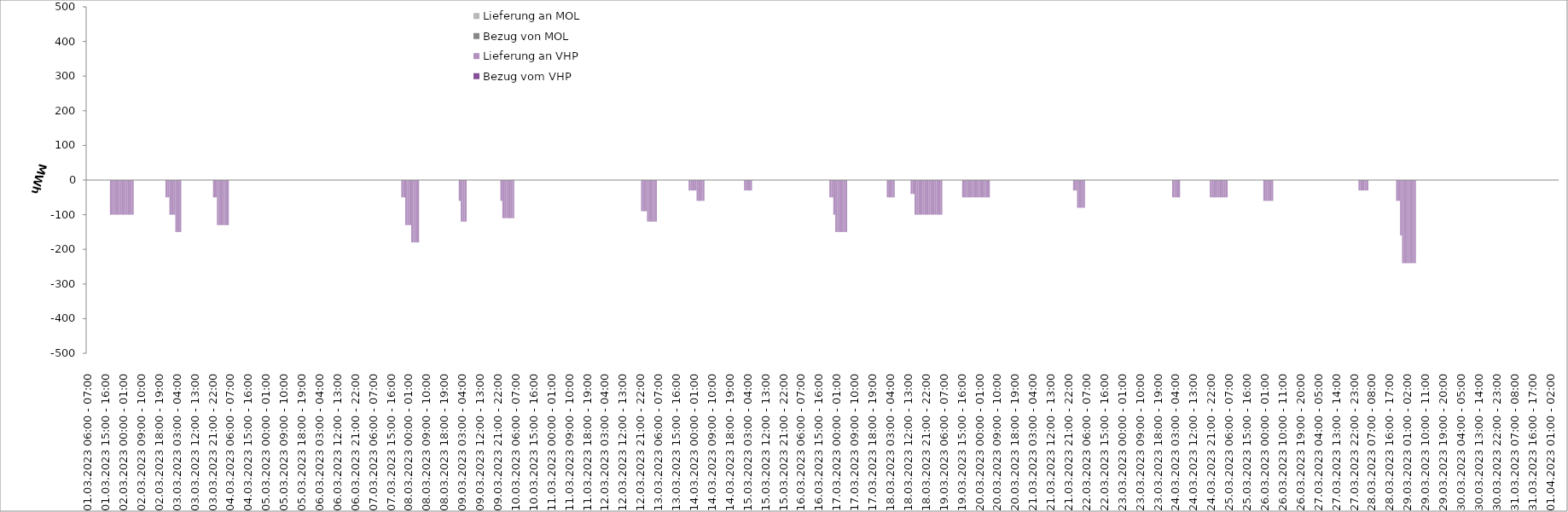
| Category | Bezug vom VHP | Lieferung an VHP | Bezug von MOL | Lieferung an MOL |
|---|---|---|---|---|
| 01.03.2023 06:00 - 07:00 | 0 | 0 | 0 | 0 |
| 01.03.2023 07:00 - 08:00 | 0 | 0 | 0 | 0 |
| 01.03.2023 08:00 - 09:00 | 0 | 0 | 0 | 0 |
| 01.03.2023 09:00 - 10:00 | 0 | 0 | 0 | 0 |
| 01.03.2023 10:00 - 11:00 | 0 | 0 | 0 | 0 |
| 01.03.2023 11:00 - 12:00 | 0 | 0 | 0 | 0 |
| 01.03.2023 12:00 - 13:00 | 0 | 0 | 0 | 0 |
| 01.03.2023 13:00 - 14:00 | 0 | 0 | 0 | 0 |
| 01.03.2023 14:00 - 15:00 | 0 | 0 | 0 | 0 |
| 01.03.2023 15:00 - 16:00 | 0 | 0 | 0 | 0 |
| 01.03.2023 16:00 - 17:00 | 0 | 0 | 0 | 0 |
| 01.03.2023 17:00 - 18:00 | 0 | 0 | 0 | 0 |
| 01.03.2023 18:00 - 19:00 | 0 | -100 | 0 | 0 |
| 01.03.2023 19:00 - 20:00 | 0 | -100 | 0 | 0 |
| 01.03.2023 20:00 - 21:00 | 0 | -100 | 0 | 0 |
| 01.03.2023 21:00 - 22:00 | 0 | -100 | 0 | 0 |
| 01.03.2023 22:00 - 23:00 | 0 | -100 | 0 | 0 |
| 01.03.2023 23:00 - 24:00 | 0 | -100 | 0 | 0 |
| 02.03.2023 00:00 - 01:00 | 0 | -100 | 0 | 0 |
| 02.03.2023 01:00 - 02:00 | 0 | -100 | 0 | 0 |
| 02.03.2023 02:00 - 03:00 | 0 | -100 | 0 | 0 |
| 02.03.2023 03:00 - 04:00 | 0 | -100 | 0 | 0 |
| 02.03.2023 04:00 - 05:00 | 0 | -100 | 0 | 0 |
| 02.03.2023 05:00 - 06:00 | 0 | -100 | 0 | 0 |
| 02.03.2023 06:00 - 07:00 | 0 | 0 | 0 | 0 |
| 02.03.2023 07:00 - 08:00 | 0 | 0 | 0 | 0 |
| 02.03.2023 08:00 - 09:00 | 0 | 0 | 0 | 0 |
| 02.03.2023 09:00 - 10:00 | 0 | 0 | 0 | 0 |
| 02.03.2023 10:00 - 11:00 | 0 | 0 | 0 | 0 |
| 02.03.2023 11:00 - 12:00 | 0 | 0 | 0 | 0 |
| 02.03.2023 12:00 - 13:00 | 0 | 0 | 0 | 0 |
| 02.03.2023 13:00 - 14:00 | 0 | 0 | 0 | 0 |
| 02.03.2023 14:00 - 15:00 | 0 | 0 | 0 | 0 |
| 02.03.2023 15:00 - 16:00 | 0 | 0 | 0 | 0 |
| 02.03.2023 16:00 - 17:00 | 0 | 0 | 0 | 0 |
| 02.03.2023 17:00 - 18:00 | 0 | 0 | 0 | 0 |
| 02.03.2023 18:00 - 19:00 | 0 | 0 | 0 | 0 |
| 02.03.2023 19:00 - 20:00 | 0 | 0 | 0 | 0 |
| 02.03.2023 20:00 - 21:00 | 0 | 0 | 0 | 0 |
| 02.03.2023 21:00 - 22:00 | 0 | 0 | 0 | 0 |
| 02.03.2023 22:00 - 23:00 | 0 | -50 | 0 | 0 |
| 02.03.2023 23:00 - 24:00 | 0 | -50 | 0 | 0 |
| 03.03.2023 00:00 - 01:00 | 0 | -100 | 0 | 0 |
| 03.03.2023 01:00 - 02:00 | 0 | -100 | 0 | 0 |
| 03.03.2023 02:00 - 03:00 | 0 | -100 | 0 | 0 |
| 03.03.2023 03:00 - 04:00 | 0 | -150 | 0 | 0 |
| 03.03.2023 04:00 - 05:00 | 0 | -150 | 0 | 0 |
| 03.03.2023 05:00 - 06:00 | 0 | -150 | 0 | 0 |
| 03.03.2023 06:00 - 07:00 | 0 | 0 | 0 | 0 |
| 03.03.2023 07:00 - 08:00 | 0 | 0 | 0 | 0 |
| 03.03.2023 08:00 - 09:00 | 0 | 0 | 0 | 0 |
| 03.03.2023 09:00 - 10:00 | 0 | 0 | 0 | 0 |
| 03.03.2023 10:00 - 11:00 | 0 | 0 | 0 | 0 |
| 03.03.2023 11:00 - 12:00 | 0 | 0 | 0 | 0 |
| 03.03.2023 12:00 - 13:00 | 0 | 0 | 0 | 0 |
| 03.03.2023 13:00 - 14:00 | 0 | 0 | 0 | 0 |
| 03.03.2023 14:00 - 15:00 | 0 | 0 | 0 | 0 |
| 03.03.2023 15:00 - 16:00 | 0 | 0 | 0 | 0 |
| 03.03.2023 16:00 - 17:00 | 0 | 0 | 0 | 0 |
| 03.03.2023 17:00 - 18:00 | 0 | 0 | 0 | 0 |
| 03.03.2023 18:00 - 19:00 | 0 | 0 | 0 | 0 |
| 03.03.2023 19:00 - 20:00 | 0 | 0 | 0 | 0 |
| 03.03.2023 20:00 - 21:00 | 0 | 0 | 0 | 0 |
| 03.03.2023 21:00 - 22:00 | 0 | 0 | 0 | 0 |
| 03.03.2023 22:00 - 23:00 | 0 | -50 | 0 | 0 |
| 03.03.2023 23:00 - 24:00 | 0 | -50 | 0 | 0 |
| 04.03.2023 00:00 - 01:00 | 0 | -130 | 0 | 0 |
| 04.03.2023 01:00 - 02:00 | 0 | -130 | 0 | 0 |
| 04.03.2023 02:00 - 03:00 | 0 | -130 | 0 | 0 |
| 04.03.2023 03:00 - 04:00 | 0 | -130 | 0 | 0 |
| 04.03.2023 04:00 - 05:00 | 0 | -130 | 0 | 0 |
| 04.03.2023 05:00 - 06:00 | 0 | -130 | 0 | 0 |
| 04.03.2023 06:00 - 07:00 | 0 | 0 | 0 | 0 |
| 04.03.2023 07:00 - 08:00 | 0 | 0 | 0 | 0 |
| 04.03.2023 08:00 - 09:00 | 0 | 0 | 0 | 0 |
| 04.03.2023 09:00 - 10:00 | 0 | 0 | 0 | 0 |
| 04.03.2023 10:00 - 11:00 | 0 | 0 | 0 | 0 |
| 04.03.2023 11:00 - 12:00 | 0 | 0 | 0 | 0 |
| 04.03.2023 12:00 - 13:00 | 0 | 0 | 0 | 0 |
| 04.03.2023 13:00 - 14:00 | 0 | 0 | 0 | 0 |
| 04.03.2023 14:00 - 15:00 | 0 | 0 | 0 | 0 |
| 04.03.2023 15:00 - 16:00 | 0 | 0 | 0 | 0 |
| 04.03.2023 16:00 - 17:00 | 0 | 0 | 0 | 0 |
| 04.03.2023 17:00 - 18:00 | 0 | 0 | 0 | 0 |
| 04.03.2023 18:00 - 19:00 | 0 | 0 | 0 | 0 |
| 04.03.2023 19:00 - 20:00 | 0 | 0 | 0 | 0 |
| 04.03.2023 20:00 - 21:00 | 0 | 0 | 0 | 0 |
| 04.03.2023 21:00 - 22:00 | 0 | 0 | 0 | 0 |
| 04.03.2023 22:00 - 23:00 | 0 | 0 | 0 | 0 |
| 04.03.2023 23:00 - 24:00 | 0 | 0 | 0 | 0 |
| 05.03.2023 00:00 - 01:00 | 0 | 0 | 0 | 0 |
| 05.03.2023 01:00 - 02:00 | 0 | 0 | 0 | 0 |
| 05.03.2023 02:00 - 03:00 | 0 | 0 | 0 | 0 |
| 05.03.2023 03:00 - 04:00 | 0 | 0 | 0 | 0 |
| 05.03.2023 04:00 - 05:00 | 0 | 0 | 0 | 0 |
| 05.03.2023 05:00 - 06:00 | 0 | 0 | 0 | 0 |
| 05.03.2023 06:00 - 07:00 | 0 | 0 | 0 | 0 |
| 05.03.2023 07:00 - 08:00 | 0 | 0 | 0 | 0 |
| 05.03.2023 08:00 - 09:00 | 0 | 0 | 0 | 0 |
| 05.03.2023 09:00 - 10:00 | 0 | 0 | 0 | 0 |
| 05.03.2023 10:00 - 11:00 | 0 | 0 | 0 | 0 |
| 05.03.2023 11:00 - 12:00 | 0 | 0 | 0 | 0 |
| 05.03.2023 12:00 - 13:00 | 0 | 0 | 0 | 0 |
| 05.03.2023 13:00 - 14:00 | 0 | 0 | 0 | 0 |
| 05.03.2023 14:00 - 15:00 | 0 | 0 | 0 | 0 |
| 05.03.2023 15:00 - 16:00 | 0 | 0 | 0 | 0 |
| 05.03.2023 16:00 - 17:00 | 0 | 0 | 0 | 0 |
| 05.03.2023 17:00 - 18:00 | 0 | 0 | 0 | 0 |
| 05.03.2023 18:00 - 19:00 | 0 | 0 | 0 | 0 |
| 05.03.2023 19:00 - 20:00 | 0 | 0 | 0 | 0 |
| 05.03.2023 20:00 - 21:00 | 0 | 0 | 0 | 0 |
| 05.03.2023 21:00 - 22:00 | 0 | 0 | 0 | 0 |
| 05.03.2023 22:00 - 23:00 | 0 | 0 | 0 | 0 |
| 05.03.2023 23:00 - 24:00 | 0 | 0 | 0 | 0 |
| 06.03.2023 00:00 - 01:00 | 0 | 0 | 0 | 0 |
| 06.03.2023 01:00 - 02:00 | 0 | 0 | 0 | 0 |
| 06.03.2023 02:00 - 03:00 | 0 | 0 | 0 | 0 |
| 06.03.2023 03:00 - 04:00 | 0 | 0 | 0 | 0 |
| 06.03.2023 04:00 - 05:00 | 0 | 0 | 0 | 0 |
| 06.03.2023 05:00 - 06:00 | 0 | 0 | 0 | 0 |
| 06.03.2023 06:00 - 07:00 | 0 | 0 | 0 | 0 |
| 06.03.2023 07:00 - 08:00 | 0 | 0 | 0 | 0 |
| 06.03.2023 08:00 - 09:00 | 0 | 0 | 0 | 0 |
| 06.03.2023 09:00 - 10:00 | 0 | 0 | 0 | 0 |
| 06.03.2023 10:00 - 11:00 | 0 | 0 | 0 | 0 |
| 06.03.2023 11:00 - 12:00 | 0 | 0 | 0 | 0 |
| 06.03.2023 12:00 - 13:00 | 0 | 0 | 0 | 0 |
| 06.03.2023 13:00 - 14:00 | 0 | 0 | 0 | 0 |
| 06.03.2023 14:00 - 15:00 | 0 | 0 | 0 | 0 |
| 06.03.2023 15:00 - 16:00 | 0 | 0 | 0 | 0 |
| 06.03.2023 16:00 - 17:00 | 0 | 0 | 0 | 0 |
| 06.03.2023 17:00 - 18:00 | 0 | 0 | 0 | 0 |
| 06.03.2023 18:00 - 19:00 | 0 | 0 | 0 | 0 |
| 06.03.2023 19:00 - 20:00 | 0 | 0 | 0 | 0 |
| 06.03.2023 20:00 - 21:00 | 0 | 0 | 0 | 0 |
| 06.03.2023 21:00 - 22:00 | 0 | 0 | 0 | 0 |
| 06.03.2023 22:00 - 23:00 | 0 | 0 | 0 | 0 |
| 06.03.2023 23:00 - 24:00 | 0 | 0 | 0 | 0 |
| 07.03.2023 00:00 - 01:00 | 0 | 0 | 0 | 0 |
| 07.03.2023 01:00 - 02:00 | 0 | 0 | 0 | 0 |
| 07.03.2023 02:00 - 03:00 | 0 | 0 | 0 | 0 |
| 07.03.2023 03:00 - 04:00 | 0 | 0 | 0 | 0 |
| 07.03.2023 04:00 - 05:00 | 0 | 0 | 0 | 0 |
| 07.03.2023 05:00 - 06:00 | 0 | 0 | 0 | 0 |
| 07.03.2023 06:00 - 07:00 | 0 | 0 | 0 | 0 |
| 07.03.2023 07:00 - 08:00 | 0 | 0 | 0 | 0 |
| 07.03.2023 08:00 - 09:00 | 0 | 0 | 0 | 0 |
| 07.03.2023 09:00 - 10:00 | 0 | 0 | 0 | 0 |
| 07.03.2023 10:00 - 11:00 | 0 | 0 | 0 | 0 |
| 07.03.2023 11:00 - 12:00 | 0 | 0 | 0 | 0 |
| 07.03.2023 12:00 - 13:00 | 0 | 0 | 0 | 0 |
| 07.03.2023 13:00 - 14:00 | 0 | 0 | 0 | 0 |
| 07.03.2023 14:00 - 15:00 | 0 | 0 | 0 | 0 |
| 07.03.2023 15:00 - 16:00 | 0 | 0 | 0 | 0 |
| 07.03.2023 16:00 - 17:00 | 0 | 0 | 0 | 0 |
| 07.03.2023 17:00 - 18:00 | 0 | 0 | 0 | 0 |
| 07.03.2023 18:00 - 19:00 | 0 | 0 | 0 | 0 |
| 07.03.2023 19:00 - 20:00 | 0 | 0 | 0 | 0 |
| 07.03.2023 20:00 - 21:00 | 0 | 0 | 0 | 0 |
| 07.03.2023 21:00 - 22:00 | 0 | -50 | 0 | 0 |
| 07.03.2023 22:00 - 23:00 | 0 | -50 | 0 | 0 |
| 07.03.2023 23:00 - 24:00 | 0 | -130 | 0 | 0 |
| 08.03.2023 00:00 - 01:00 | 0 | -130 | 0 | 0 |
| 08.03.2023 01:00 - 02:00 | 0 | -130 | 0 | 0 |
| 08.03.2023 02:00 - 03:00 | 0 | -180 | 0 | 0 |
| 08.03.2023 03:00 - 04:00 | 0 | -180 | 0 | 0 |
| 08.03.2023 04:00 - 05:00 | 0 | -180 | 0 | 0 |
| 08.03.2023 05:00 - 06:00 | 0 | -180 | 0 | 0 |
| 08.03.2023 06:00 - 07:00 | 0 | 0 | 0 | 0 |
| 08.03.2023 07:00 - 08:00 | 0 | 0 | 0 | 0 |
| 08.03.2023 08:00 - 09:00 | 0 | 0 | 0 | 0 |
| 08.03.2023 09:00 - 10:00 | 0 | 0 | 0 | 0 |
| 08.03.2023 10:00 - 11:00 | 0 | 0 | 0 | 0 |
| 08.03.2023 11:00 - 12:00 | 0 | 0 | 0 | 0 |
| 08.03.2023 12:00 - 13:00 | 0 | 0 | 0 | 0 |
| 08.03.2023 13:00 - 14:00 | 0 | 0 | 0 | 0 |
| 08.03.2023 14:00 - 15:00 | 0 | 0 | 0 | 0 |
| 08.03.2023 15:00 - 16:00 | 0 | 0 | 0 | 0 |
| 08.03.2023 16:00 - 17:00 | 0 | 0 | 0 | 0 |
| 08.03.2023 17:00 - 18:00 | 0 | 0 | 0 | 0 |
| 08.03.2023 18:00 - 19:00 | 0 | 0 | 0 | 0 |
| 08.03.2023 19:00 - 20:00 | 0 | 0 | 0 | 0 |
| 08.03.2023 20:00 - 21:00 | 0 | 0 | 0 | 0 |
| 08.03.2023 21:00 - 22:00 | 0 | 0 | 0 | 0 |
| 08.03.2023 22:00 - 23:00 | 0 | 0 | 0 | 0 |
| 08.03.2023 23:00 - 24:00 | 0 | 0 | 0 | 0 |
| 09.03.2023 00:00 - 01:00 | 0 | 0 | 0 | 0 |
| 09.03.2023 01:00 - 02:00 | 0 | 0 | 0 | 0 |
| 09.03.2023 02:00 - 03:00 | 0 | -60 | 0 | 0 |
| 09.03.2023 03:00 - 04:00 | 0 | -120 | 0 | 0 |
| 09.03.2023 04:00 - 05:00 | 0 | -120 | 0 | 0 |
| 09.03.2023 05:00 - 06:00 | 0 | -120 | 0 | 0 |
| 09.03.2023 06:00 - 07:00 | 0 | 0 | 0 | 0 |
| 09.03.2023 07:00 - 08:00 | 0 | 0 | 0 | 0 |
| 09.03.2023 08:00 - 09:00 | 0 | 0 | 0 | 0 |
| 09.03.2023 09:00 - 10:00 | 0 | 0 | 0 | 0 |
| 09.03.2023 10:00 - 11:00 | 0 | 0 | 0 | 0 |
| 09.03.2023 11:00 - 12:00 | 0 | 0 | 0 | 0 |
| 09.03.2023 12:00 - 13:00 | 0 | 0 | 0 | 0 |
| 09.03.2023 13:00 - 14:00 | 0 | 0 | 0 | 0 |
| 09.03.2023 14:00 - 15:00 | 0 | 0 | 0 | 0 |
| 09.03.2023 15:00 - 16:00 | 0 | 0 | 0 | 0 |
| 09.03.2023 16:00 - 17:00 | 0 | 0 | 0 | 0 |
| 09.03.2023 17:00 - 18:00 | 0 | 0 | 0 | 0 |
| 09.03.2023 18:00 - 19:00 | 0 | 0 | 0 | 0 |
| 09.03.2023 19:00 - 20:00 | 0 | 0 | 0 | 0 |
| 09.03.2023 20:00 - 21:00 | 0 | 0 | 0 | 0 |
| 09.03.2023 21:00 - 22:00 | 0 | 0 | 0 | 0 |
| 09.03.2023 22:00 - 23:00 | 0 | 0 | 0 | 0 |
| 09.03.2023 23:00 - 24:00 | 0 | -60 | 0 | 0 |
| 10.03.2023 00:00 - 01:00 | 0 | -110 | 0 | 0 |
| 10.03.2023 01:00 - 02:00 | 0 | -110 | 0 | 0 |
| 10.03.2023 02:00 - 03:00 | 0 | -110 | 0 | 0 |
| 10.03.2023 03:00 - 04:00 | 0 | -110 | 0 | 0 |
| 10.03.2023 04:00 - 05:00 | 0 | -110 | 0 | 0 |
| 10.03.2023 05:00 - 06:00 | 0 | -110 | 0 | 0 |
| 10.03.2023 06:00 - 07:00 | 0 | 0 | 0 | 0 |
| 10.03.2023 07:00 - 08:00 | 0 | 0 | 0 | 0 |
| 10.03.2023 08:00 - 09:00 | 0 | 0 | 0 | 0 |
| 10.03.2023 09:00 - 10:00 | 0 | 0 | 0 | 0 |
| 10.03.2023 10:00 - 11:00 | 0 | 0 | 0 | 0 |
| 10.03.2023 11:00 - 12:00 | 0 | 0 | 0 | 0 |
| 10.03.2023 12:00 - 13:00 | 0 | 0 | 0 | 0 |
| 10.03.2023 13:00 - 14:00 | 0 | 0 | 0 | 0 |
| 10.03.2023 14:00 - 15:00 | 0 | 0 | 0 | 0 |
| 10.03.2023 15:00 - 16:00 | 0 | 0 | 0 | 0 |
| 10.03.2023 16:00 - 17:00 | 0 | 0 | 0 | 0 |
| 10.03.2023 17:00 - 18:00 | 0 | 0 | 0 | 0 |
| 10.03.2023 18:00 - 19:00 | 0 | 0 | 0 | 0 |
| 10.03.2023 19:00 - 20:00 | 0 | 0 | 0 | 0 |
| 10.03.2023 20:00 - 21:00 | 0 | 0 | 0 | 0 |
| 10.03.2023 21:00 - 22:00 | 0 | 0 | 0 | 0 |
| 10.03.2023 22:00 - 23:00 | 0 | 0 | 0 | 0 |
| 10.03.2023 23:00 - 24:00 | 0 | 0 | 0 | 0 |
| 11.03.2023 00:00 - 01:00 | 0 | 0 | 0 | 0 |
| 11.03.2023 01:00 - 02:00 | 0 | 0 | 0 | 0 |
| 11.03.2023 02:00 - 03:00 | 0 | 0 | 0 | 0 |
| 11.03.2023 03:00 - 04:00 | 0 | 0 | 0 | 0 |
| 11.03.2023 04:00 - 05:00 | 0 | 0 | 0 | 0 |
| 11.03.2023 05:00 - 06:00 | 0 | 0 | 0 | 0 |
| 11.03.2023 06:00 - 07:00 | 0 | 0 | 0 | 0 |
| 11.03.2023 07:00 - 08:00 | 0 | 0 | 0 | 0 |
| 11.03.2023 08:00 - 09:00 | 0 | 0 | 0 | 0 |
| 11.03.2023 09:00 - 10:00 | 0 | 0 | 0 | 0 |
| 11.03.2023 10:00 - 11:00 | 0 | 0 | 0 | 0 |
| 11.03.2023 11:00 - 12:00 | 0 | 0 | 0 | 0 |
| 11.03.2023 12:00 - 13:00 | 0 | 0 | 0 | 0 |
| 11.03.2023 13:00 - 14:00 | 0 | 0 | 0 | 0 |
| 11.03.2023 14:00 - 15:00 | 0 | 0 | 0 | 0 |
| 11.03.2023 15:00 - 16:00 | 0 | 0 | 0 | 0 |
| 11.03.2023 16:00 - 17:00 | 0 | 0 | 0 | 0 |
| 11.03.2023 17:00 - 18:00 | 0 | 0 | 0 | 0 |
| 11.03.2023 18:00 - 19:00 | 0 | 0 | 0 | 0 |
| 11.03.2023 19:00 - 20:00 | 0 | 0 | 0 | 0 |
| 11.03.2023 20:00 - 21:00 | 0 | 0 | 0 | 0 |
| 11.03.2023 21:00 - 22:00 | 0 | 0 | 0 | 0 |
| 11.03.2023 22:00 - 23:00 | 0 | 0 | 0 | 0 |
| 11.03.2023 23:00 - 24:00 | 0 | 0 | 0 | 0 |
| 12.03.2023 00:00 - 01:00 | 0 | 0 | 0 | 0 |
| 12.03.2023 01:00 - 02:00 | 0 | 0 | 0 | 0 |
| 12.03.2023 02:00 - 03:00 | 0 | 0 | 0 | 0 |
| 12.03.2023 03:00 - 04:00 | 0 | 0 | 0 | 0 |
| 12.03.2023 04:00 - 05:00 | 0 | 0 | 0 | 0 |
| 12.03.2023 05:00 - 06:00 | 0 | 0 | 0 | 0 |
| 12.03.2023 06:00 - 07:00 | 0 | 0 | 0 | 0 |
| 12.03.2023 07:00 - 08:00 | 0 | 0 | 0 | 0 |
| 12.03.2023 08:00 - 09:00 | 0 | 0 | 0 | 0 |
| 12.03.2023 09:00 - 10:00 | 0 | 0 | 0 | 0 |
| 12.03.2023 10:00 - 11:00 | 0 | 0 | 0 | 0 |
| 12.03.2023 11:00 - 12:00 | 0 | 0 | 0 | 0 |
| 12.03.2023 12:00 - 13:00 | 0 | 0 | 0 | 0 |
| 12.03.2023 13:00 - 14:00 | 0 | 0 | 0 | 0 |
| 12.03.2023 14:00 - 15:00 | 0 | 0 | 0 | 0 |
| 12.03.2023 15:00 - 16:00 | 0 | 0 | 0 | 0 |
| 12.03.2023 16:00 - 17:00 | 0 | 0 | 0 | 0 |
| 12.03.2023 17:00 - 18:00 | 0 | 0 | 0 | 0 |
| 12.03.2023 18:00 - 19:00 | 0 | 0 | 0 | 0 |
| 12.03.2023 19:00 - 20:00 | 0 | 0 | 0 | 0 |
| 12.03.2023 20:00 - 21:00 | 0 | 0 | 0 | 0 |
| 12.03.2023 21:00 - 22:00 | 0 | 0 | 0 | 0 |
| 12.03.2023 22:00 - 23:00 | 0 | -90 | 0 | 0 |
| 12.03.2023 23:00 - 24:00 | 0 | -90 | 0 | 0 |
| 13.03.2023 00:00 - 01:00 | 0 | -90 | 0 | 0 |
| 13.03.2023 01:00 - 02:00 | 0 | -120 | 0 | 0 |
| 13.03.2023 02:00 - 03:00 | 0 | -120 | 0 | 0 |
| 13.03.2023 03:00 - 04:00 | 0 | -120 | 0 | 0 |
| 13.03.2023 04:00 - 05:00 | 0 | -120 | 0 | 0 |
| 13.03.2023 05:00 - 06:00 | 0 | -120 | 0 | 0 |
| 13.03.2023 06:00 - 07:00 | 0 | 0 | 0 | 0 |
| 13.03.2023 07:00 - 08:00 | 0 | 0 | 0 | 0 |
| 13.03.2023 08:00 - 09:00 | 0 | 0 | 0 | 0 |
| 13.03.2023 09:00 - 10:00 | 0 | 0 | 0 | 0 |
| 13.03.2023 10:00 - 11:00 | 0 | 0 | 0 | 0 |
| 13.03.2023 11:00 - 12:00 | 0 | 0 | 0 | 0 |
| 13.03.2023 12:00 - 13:00 | 0 | 0 | 0 | 0 |
| 13.03.2023 13:00 - 14:00 | 0 | 0 | 0 | 0 |
| 13.03.2023 14:00 - 15:00 | 0 | 0 | 0 | 0 |
| 13.03.2023 15:00 - 16:00 | 0 | 0 | 0 | 0 |
| 13.03.2023 16:00 - 17:00 | 0 | 0 | 0 | 0 |
| 13.03.2023 17:00 - 18:00 | 0 | 0 | 0 | 0 |
| 13.03.2023 18:00 - 19:00 | 0 | 0 | 0 | 0 |
| 13.03.2023 19:00 - 20:00 | 0 | 0 | 0 | 0 |
| 13.03.2023 20:00 - 21:00 | 0 | 0 | 0 | 0 |
| 13.03.2023 21:00 - 22:00 | 0 | 0 | 0 | 0 |
| 13.03.2023 22:00 - 23:00 | 0 | -30 | 0 | 0 |
| 13.03.2023 23:00 - 24:00 | 0 | -30 | 0 | 0 |
| 14.03.2023 00:00 - 01:00 | 0 | -30 | 0 | 0 |
| 14.03.2023 01:00 - 02:00 | 0 | -30 | 0 | 0 |
| 14.03.2023 02:00 - 03:00 | 0 | -60 | 0 | 0 |
| 14.03.2023 03:00 - 04:00 | 0 | -60 | 0 | 0 |
| 14.03.2023 04:00 - 05:00 | 0 | -60 | 0 | 0 |
| 14.03.2023 05:00 - 06:00 | 0 | -60 | 0 | 0 |
| 14.03.2023 06:00 - 07:00 | 0 | 0 | 0 | 0 |
| 14.03.2023 07:00 - 08:00 | 0 | 0 | 0 | 0 |
| 14.03.2023 08:00 - 09:00 | 0 | 0 | 0 | 0 |
| 14.03.2023 09:00 - 10:00 | 0 | 0 | 0 | 0 |
| 14.03.2023 10:00 - 11:00 | 0 | 0 | 0 | 0 |
| 14.03.2023 11:00 - 12:00 | 0 | 0 | 0 | 0 |
| 14.03.2023 12:00 - 13:00 | 0 | 0 | 0 | 0 |
| 14.03.2023 13:00 - 14:00 | 0 | 0 | 0 | 0 |
| 14.03.2023 14:00 - 15:00 | 0 | 0 | 0 | 0 |
| 14.03.2023 15:00 - 16:00 | 0 | 0 | 0 | 0 |
| 14.03.2023 16:00 - 17:00 | 0 | 0 | 0 | 0 |
| 14.03.2023 17:00 - 18:00 | 0 | 0 | 0 | 0 |
| 14.03.2023 18:00 - 19:00 | 0 | 0 | 0 | 0 |
| 14.03.2023 19:00 - 20:00 | 0 | 0 | 0 | 0 |
| 14.03.2023 20:00 - 21:00 | 0 | 0 | 0 | 0 |
| 14.03.2023 21:00 - 22:00 | 0 | 0 | 0 | 0 |
| 14.03.2023 22:00 - 23:00 | 0 | 0 | 0 | 0 |
| 14.03.2023 23:00 - 24:00 | 0 | 0 | 0 | 0 |
| 15.03.2023 00:00 - 01:00 | 0 | 0 | 0 | 0 |
| 15.03.2023 01:00 - 02:00 | 0 | 0 | 0 | 0 |
| 15.03.2023 02:00 - 03:00 | 0 | -30 | 0 | 0 |
| 15.03.2023 03:00 - 04:00 | 0 | -30 | 0 | 0 |
| 15.03.2023 04:00 - 05:00 | 0 | -30 | 0 | 0 |
| 15.03.2023 05:00 - 06:00 | 0 | -30 | 0 | 0 |
| 15.03.2023 06:00 - 07:00 | 0 | 0 | 0 | 0 |
| 15.03.2023 07:00 - 08:00 | 0 | 0 | 0 | 0 |
| 15.03.2023 08:00 - 09:00 | 0 | 0 | 0 | 0 |
| 15.03.2023 09:00 - 10:00 | 0 | 0 | 0 | 0 |
| 15.03.2023 10:00 - 11:00 | 0 | 0 | 0 | 0 |
| 15.03.2023 11:00 - 12:00 | 0 | 0 | 0 | 0 |
| 15.03.2023 12:00 - 13:00 | 0 | 0 | 0 | 0 |
| 15.03.2023 13:00 - 14:00 | 0 | 0 | 0 | 0 |
| 15.03.2023 14:00 - 15:00 | 0 | 0 | 0 | 0 |
| 15.03.2023 15:00 - 16:00 | 0 | 0 | 0 | 0 |
| 15.03.2023 16:00 - 17:00 | 0 | 0 | 0 | 0 |
| 15.03.2023 17:00 - 18:00 | 0 | 0 | 0 | 0 |
| 15.03.2023 18:00 - 19:00 | 0 | 0 | 0 | 0 |
| 15.03.2023 19:00 - 20:00 | 0 | 0 | 0 | 0 |
| 15.03.2023 20:00 - 21:00 | 0 | 0 | 0 | 0 |
| 15.03.2023 21:00 - 22:00 | 0 | 0 | 0 | 0 |
| 15.03.2023 22:00 - 23:00 | 0 | 0 | 0 | 0 |
| 15.03.2023 23:00 - 24:00 | 0 | 0 | 0 | 0 |
| 16.03.2023 00:00 - 01:00 | 0 | 0 | 0 | 0 |
| 16.03.2023 01:00 - 02:00 | 0 | 0 | 0 | 0 |
| 16.03.2023 02:00 - 03:00 | 0 | 0 | 0 | 0 |
| 16.03.2023 03:00 - 04:00 | 0 | 0 | 0 | 0 |
| 16.03.2023 04:00 - 05:00 | 0 | 0 | 0 | 0 |
| 16.03.2023 05:00 - 06:00 | 0 | 0 | 0 | 0 |
| 16.03.2023 06:00 - 07:00 | 0 | 0 | 0 | 0 |
| 16.03.2023 07:00 - 08:00 | 0 | 0 | 0 | 0 |
| 16.03.2023 08:00 - 09:00 | 0 | 0 | 0 | 0 |
| 16.03.2023 09:00 - 10:00 | 0 | 0 | 0 | 0 |
| 16.03.2023 10:00 - 11:00 | 0 | 0 | 0 | 0 |
| 16.03.2023 11:00 - 12:00 | 0 | 0 | 0 | 0 |
| 16.03.2023 12:00 - 13:00 | 0 | 0 | 0 | 0 |
| 16.03.2023 13:00 - 14:00 | 0 | 0 | 0 | 0 |
| 16.03.2023 14:00 - 15:00 | 0 | 0 | 0 | 0 |
| 16.03.2023 15:00 - 16:00 | 0 | 0 | 0 | 0 |
| 16.03.2023 16:00 - 17:00 | 0 | 0 | 0 | 0 |
| 16.03.2023 17:00 - 18:00 | 0 | 0 | 0 | 0 |
| 16.03.2023 18:00 - 19:00 | 0 | 0 | 0 | 0 |
| 16.03.2023 19:00 - 20:00 | 0 | 0 | 0 | 0 |
| 16.03.2023 20:00 - 21:00 | 0 | 0 | 0 | 0 |
| 16.03.2023 21:00 - 22:00 | 0 | -50 | 0 | 0 |
| 16.03.2023 22:00 - 23:00 | 0 | -50 | 0 | 0 |
| 16.03.2023 23:00 - 24:00 | 0 | -100 | 0 | 0 |
| 17.03.2023 00:00 - 01:00 | 0 | -150 | 0 | 0 |
| 17.03.2023 01:00 - 02:00 | 0 | -150 | 0 | 0 |
| 17.03.2023 02:00 - 03:00 | 0 | -150 | 0 | 0 |
| 17.03.2023 03:00 - 04:00 | 0 | -150 | 0 | 0 |
| 17.03.2023 04:00 - 05:00 | 0 | -150 | 0 | 0 |
| 17.03.2023 05:00 - 06:00 | 0 | -150 | 0 | 0 |
| 17.03.2023 06:00 - 07:00 | 0 | 0 | 0 | 0 |
| 17.03.2023 07:00 - 08:00 | 0 | 0 | 0 | 0 |
| 17.03.2023 08:00 - 09:00 | 0 | 0 | 0 | 0 |
| 17.03.2023 09:00 - 10:00 | 0 | 0 | 0 | 0 |
| 17.03.2023 10:00 - 11:00 | 0 | 0 | 0 | 0 |
| 17.03.2023 11:00 - 12:00 | 0 | 0 | 0 | 0 |
| 17.03.2023 12:00 - 13:00 | 0 | 0 | 0 | 0 |
| 17.03.2023 13:00 - 14:00 | 0 | 0 | 0 | 0 |
| 17.03.2023 14:00 - 15:00 | 0 | 0 | 0 | 0 |
| 17.03.2023 15:00 - 16:00 | 0 | 0 | 0 | 0 |
| 17.03.2023 16:00 - 17:00 | 0 | 0 | 0 | 0 |
| 17.03.2023 17:00 - 18:00 | 0 | 0 | 0 | 0 |
| 17.03.2023 18:00 - 19:00 | 0 | 0 | 0 | 0 |
| 17.03.2023 19:00 - 20:00 | 0 | 0 | 0 | 0 |
| 17.03.2023 20:00 - 21:00 | 0 | 0 | 0 | 0 |
| 17.03.2023 21:00 - 22:00 | 0 | 0 | 0 | 0 |
| 17.03.2023 22:00 - 23:00 | 0 | 0 | 0 | 0 |
| 17.03.2023 23:00 - 24:00 | 0 | 0 | 0 | 0 |
| 18.03.2023 00:00 - 01:00 | 0 | 0 | 0 | 0 |
| 18.03.2023 01:00 - 02:00 | 0 | 0 | 0 | 0 |
| 18.03.2023 02:00 - 03:00 | 0 | -50 | 0 | 0 |
| 18.03.2023 03:00 - 04:00 | 0 | -50 | 0 | 0 |
| 18.03.2023 04:00 - 05:00 | 0 | -50 | 0 | 0 |
| 18.03.2023 05:00 - 06:00 | 0 | -50 | 0 | 0 |
| 18.03.2023 06:00 - 07:00 | 0 | 0 | 0 | 0 |
| 18.03.2023 07:00 - 08:00 | 0 | 0 | 0 | 0 |
| 18.03.2023 08:00 - 09:00 | 0 | 0 | 0 | 0 |
| 18.03.2023 09:00 - 10:00 | 0 | 0 | 0 | 0 |
| 18.03.2023 10:00 - 11:00 | 0 | 0 | 0 | 0 |
| 18.03.2023 11:00 - 12:00 | 0 | 0 | 0 | 0 |
| 18.03.2023 12:00 - 13:00 | 0 | 0 | 0 | 0 |
| 18.03.2023 13:00 - 14:00 | 0 | 0 | 0 | 0 |
| 18.03.2023 14:00 - 15:00 | 0 | -40 | 0 | 0 |
| 18.03.2023 15:00 - 16:00 | 0 | -40 | 0 | 0 |
| 18.03.2023 16:00 - 17:00 | 0 | -100 | 0 | 0 |
| 18.03.2023 17:00 - 18:00 | 0 | -100 | 0 | 0 |
| 18.03.2023 18:00 - 19:00 | 0 | -100 | 0 | 0 |
| 18.03.2023 19:00 - 20:00 | 0 | -100 | 0 | 0 |
| 18.03.2023 20:00 - 21:00 | 0 | -100 | 0 | 0 |
| 18.03.2023 21:00 - 22:00 | 0 | -100 | 0 | 0 |
| 18.03.2023 22:00 - 23:00 | 0 | -100 | 0 | 0 |
| 18.03.2023 23:00 - 24:00 | 0 | -100 | 0 | 0 |
| 19.03.2023 00:00 - 01:00 | 0 | -100 | 0 | 0 |
| 19.03.2023 01:00 - 02:00 | 0 | -100 | 0 | 0 |
| 19.03.2023 02:00 - 03:00 | 0 | -100 | 0 | 0 |
| 19.03.2023 03:00 - 04:00 | 0 | -100 | 0 | 0 |
| 19.03.2023 04:00 - 05:00 | 0 | -100 | 0 | 0 |
| 19.03.2023 05:00 - 06:00 | 0 | -100 | 0 | 0 |
| 19.03.2023 06:00 - 07:00 | 0 | 0 | 0 | 0 |
| 19.03.2023 07:00 - 08:00 | 0 | 0 | 0 | 0 |
| 19.03.2023 08:00 - 09:00 | 0 | 0 | 0 | 0 |
| 19.03.2023 09:00 - 10:00 | 0 | 0 | 0 | 0 |
| 19.03.2023 10:00 - 11:00 | 0 | 0 | 0 | 0 |
| 19.03.2023 11:00 - 12:00 | 0 | 0 | 0 | 0 |
| 19.03.2023 12:00 - 13:00 | 0 | 0 | 0 | 0 |
| 19.03.2023 13:00 - 14:00 | 0 | 0 | 0 | 0 |
| 19.03.2023 14:00 - 15:00 | 0 | 0 | 0 | 0 |
| 19.03.2023 15:00 - 16:00 | 0 | 0 | 0 | 0 |
| 19.03.2023 16:00 - 17:00 | 0 | -50 | 0 | 0 |
| 19.03.2023 17:00 - 18:00 | 0 | -50 | 0 | 0 |
| 19.03.2023 18:00 - 19:00 | 0 | -50 | 0 | 0 |
| 19.03.2023 19:00 - 20:00 | 0 | -50 | 0 | 0 |
| 19.03.2023 20:00 - 21:00 | 0 | -50 | 0 | 0 |
| 19.03.2023 21:00 - 22:00 | 0 | -50 | 0 | 0 |
| 19.03.2023 22:00 - 23:00 | 0 | -50 | 0 | 0 |
| 19.03.2023 23:00 - 24:00 | 0 | -50 | 0 | 0 |
| 20.03.2023 00:00 - 01:00 | 0 | -50 | 0 | 0 |
| 20.03.2023 01:00 - 02:00 | 0 | -50 | 0 | 0 |
| 20.03.2023 02:00 - 03:00 | 0 | -50 | 0 | 0 |
| 20.03.2023 03:00 - 04:00 | 0 | -50 | 0 | 0 |
| 20.03.2023 04:00 - 05:00 | 0 | -50 | 0 | 0 |
| 20.03.2023 05:00 - 06:00 | 0 | -50 | 0 | 0 |
| 20.03.2023 06:00 - 07:00 | 0 | 0 | 0 | 0 |
| 20.03.2023 07:00 - 08:00 | 0 | 0 | 0 | 0 |
| 20.03.2023 08:00 - 09:00 | 0 | 0 | 0 | 0 |
| 20.03.2023 09:00 - 10:00 | 0 | 0 | 0 | 0 |
| 20.03.2023 10:00 - 11:00 | 0 | 0 | 0 | 0 |
| 20.03.2023 11:00 - 12:00 | 0 | 0 | 0 | 0 |
| 20.03.2023 12:00 - 13:00 | 0 | 0 | 0 | 0 |
| 20.03.2023 13:00 - 14:00 | 0 | 0 | 0 | 0 |
| 20.03.2023 14:00 - 15:00 | 0 | 0 | 0 | 0 |
| 20.03.2023 15:00 - 16:00 | 0 | 0 | 0 | 0 |
| 20.03.2023 16:00 - 17:00 | 0 | 0 | 0 | 0 |
| 20.03.2023 17:00 - 18:00 | 0 | 0 | 0 | 0 |
| 20.03.2023 18:00 - 19:00 | 0 | 0 | 0 | 0 |
| 20.03.2023 19:00 - 20:00 | 0 | 0 | 0 | 0 |
| 20.03.2023 20:00 - 21:00 | 0 | 0 | 0 | 0 |
| 20.03.2023 21:00 - 22:00 | 0 | 0 | 0 | 0 |
| 20.03.2023 22:00 - 23:00 | 0 | 0 | 0 | 0 |
| 20.03.2023 23:00 - 24:00 | 0 | 0 | 0 | 0 |
| 21.03.2023 00:00 - 01:00 | 0 | 0 | 0 | 0 |
| 21.03.2023 01:00 - 02:00 | 0 | 0 | 0 | 0 |
| 21.03.2023 02:00 - 03:00 | 0 | 0 | 0 | 0 |
| 21.03.2023 03:00 - 04:00 | 0 | 0 | 0 | 0 |
| 21.03.2023 04:00 - 05:00 | 0 | 0 | 0 | 0 |
| 21.03.2023 05:00 - 06:00 | 0 | 0 | 0 | 0 |
| 21.03.2023 06:00 - 07:00 | 0 | 0 | 0 | 0 |
| 21.03.2023 07:00 - 08:00 | 0 | 0 | 0 | 0 |
| 21.03.2023 08:00 - 09:00 | 0 | 0 | 0 | 0 |
| 21.03.2023 09:00 - 10:00 | 0 | 0 | 0 | 0 |
| 21.03.2023 10:00 - 11:00 | 0 | 0 | 0 | 0 |
| 21.03.2023 11:00 - 12:00 | 0 | 0 | 0 | 0 |
| 21.03.2023 12:00 - 13:00 | 0 | 0 | 0 | 0 |
| 21.03.2023 13:00 - 14:00 | 0 | 0 | 0 | 0 |
| 21.03.2023 14:00 - 15:00 | 0 | 0 | 0 | 0 |
| 21.03.2023 15:00 - 16:00 | 0 | 0 | 0 | 0 |
| 21.03.2023 16:00 - 17:00 | 0 | 0 | 0 | 0 |
| 21.03.2023 17:00 - 18:00 | 0 | 0 | 0 | 0 |
| 21.03.2023 18:00 - 19:00 | 0 | 0 | 0 | 0 |
| 21.03.2023 19:00 - 20:00 | 0 | 0 | 0 | 0 |
| 21.03.2023 20:00 - 21:00 | 0 | 0 | 0 | 0 |
| 21.03.2023 21:00 - 22:00 | 0 | 0 | 0 | 0 |
| 21.03.2023 22:00 - 23:00 | 0 | 0 | 0 | 0 |
| 21.03.2023 23:00 - 24:00 | 0 | 0 | 0 | 0 |
| 22.03.2023 00:00 - 01:00 | 0 | -30 | 0 | 0 |
| 22.03.2023 01:00 - 02:00 | 0 | -30 | 0 | 0 |
| 22.03.2023 02:00 - 03:00 | 0 | -80 | 0 | 0 |
| 22.03.2023 03:00 - 04:00 | 0 | -80 | 0 | 0 |
| 22.03.2023 04:00 - 05:00 | 0 | -80 | 0 | 0 |
| 22.03.2023 05:00 - 06:00 | 0 | -80 | 0 | 0 |
| 22.03.2023 06:00 - 07:00 | 0 | 0 | 0 | 0 |
| 22.03.2023 07:00 - 08:00 | 0 | 0 | 0 | 0 |
| 22.03.2023 08:00 - 09:00 | 0 | 0 | 0 | 0 |
| 22.03.2023 09:00 - 10:00 | 0 | 0 | 0 | 0 |
| 22.03.2023 10:00 - 11:00 | 0 | 0 | 0 | 0 |
| 22.03.2023 11:00 - 12:00 | 0 | 0 | 0 | 0 |
| 22.03.2023 12:00 - 13:00 | 0 | 0 | 0 | 0 |
| 22.03.2023 13:00 - 14:00 | 0 | 0 | 0 | 0 |
| 22.03.2023 14:00 - 15:00 | 0 | 0 | 0 | 0 |
| 22.03.2023 15:00 - 16:00 | 0 | 0 | 0 | 0 |
| 22.03.2023 16:00 - 17:00 | 0 | 0 | 0 | 0 |
| 22.03.2023 17:00 - 18:00 | 0 | 0 | 0 | 0 |
| 22.03.2023 18:00 - 19:00 | 0 | 0 | 0 | 0 |
| 22.03.2023 19:00 - 20:00 | 0 | 0 | 0 | 0 |
| 22.03.2023 20:00 - 21:00 | 0 | 0 | 0 | 0 |
| 22.03.2023 21:00 - 22:00 | 0 | 0 | 0 | 0 |
| 22.03.2023 22:00 - 23:00 | 0 | 0 | 0 | 0 |
| 22.03.2023 23:00 - 24:00 | 0 | 0 | 0 | 0 |
| 23.03.2023 00:00 - 01:00 | 0 | 0 | 0 | 0 |
| 23.03.2023 01:00 - 02:00 | 0 | 0 | 0 | 0 |
| 23.03.2023 02:00 - 03:00 | 0 | 0 | 0 | 0 |
| 23.03.2023 03:00 - 04:00 | 0 | 0 | 0 | 0 |
| 23.03.2023 04:00 - 05:00 | 0 | 0 | 0 | 0 |
| 23.03.2023 05:00 - 06:00 | 0 | 0 | 0 | 0 |
| 23.03.2023 06:00 - 07:00 | 0 | 0 | 0 | 0 |
| 23.03.2023 07:00 - 08:00 | 0 | 0 | 0 | 0 |
| 23.03.2023 08:00 - 09:00 | 0 | 0 | 0 | 0 |
| 23.03.2023 09:00 - 10:00 | 0 | 0 | 0 | 0 |
| 23.03.2023 10:00 - 11:00 | 0 | 0 | 0 | 0 |
| 23.03.2023 11:00 - 12:00 | 0 | 0 | 0 | 0 |
| 23.03.2023 12:00 - 13:00 | 0 | 0 | 0 | 0 |
| 23.03.2023 13:00 - 14:00 | 0 | 0 | 0 | 0 |
| 23.03.2023 14:00 - 15:00 | 0 | 0 | 0 | 0 |
| 23.03.2023 15:00 - 16:00 | 0 | 0 | 0 | 0 |
| 23.03.2023 16:00 - 17:00 | 0 | 0 | 0 | 0 |
| 23.03.2023 17:00 - 18:00 | 0 | 0 | 0 | 0 |
| 23.03.2023 18:00 - 19:00 | 0 | 0 | 0 | 0 |
| 23.03.2023 19:00 - 20:00 | 0 | 0 | 0 | 0 |
| 23.03.2023 20:00 - 21:00 | 0 | 0 | 0 | 0 |
| 23.03.2023 21:00 - 22:00 | 0 | 0 | 0 | 0 |
| 23.03.2023 22:00 - 23:00 | 0 | 0 | 0 | 0 |
| 23.03.2023 23:00 - 24:00 | 0 | 0 | 0 | 0 |
| 24.03.2023 00:00 - 01:00 | 0 | 0 | 0 | 0 |
| 24.03.2023 01:00 - 02:00 | 0 | 0 | 0 | 0 |
| 24.03.2023 02:00 - 03:00 | 0 | -50 | 0 | 0 |
| 24.03.2023 03:00 - 04:00 | 0 | -50 | 0 | 0 |
| 24.03.2023 04:00 - 05:00 | 0 | -50 | 0 | 0 |
| 24.03.2023 05:00 - 06:00 | 0 | -50 | 0 | 0 |
| 24.03.2023 06:00 - 07:00 | 0 | 0 | 0 | 0 |
| 24.03.2023 07:00 - 08:00 | 0 | 0 | 0 | 0 |
| 24.03.2023 08:00 - 09:00 | 0 | 0 | 0 | 0 |
| 24.03.2023 09:00 - 10:00 | 0 | 0 | 0 | 0 |
| 24.03.2023 10:00 - 11:00 | 0 | 0 | 0 | 0 |
| 24.03.2023 11:00 - 12:00 | 0 | 0 | 0 | 0 |
| 24.03.2023 12:00 - 13:00 | 0 | 0 | 0 | 0 |
| 24.03.2023 13:00 - 14:00 | 0 | 0 | 0 | 0 |
| 24.03.2023 14:00 - 15:00 | 0 | 0 | 0 | 0 |
| 24.03.2023 15:00 - 16:00 | 0 | 0 | 0 | 0 |
| 24.03.2023 16:00 - 17:00 | 0 | 0 | 0 | 0 |
| 24.03.2023 17:00 - 18:00 | 0 | 0 | 0 | 0 |
| 24.03.2023 18:00 - 19:00 | 0 | 0 | 0 | 0 |
| 24.03.2023 19:00 - 20:00 | 0 | 0 | 0 | 0 |
| 24.03.2023 20:00 - 21:00 | 0 | 0 | 0 | 0 |
| 24.03.2023 21:00 - 22:00 | 0 | -50 | 0 | 0 |
| 24.03.2023 22:00 - 23:00 | 0 | -50 | 0 | 0 |
| 24.03.2023 23:00 - 24:00 | 0 | -50 | 0 | 0 |
| 25.03.2023 00:00 - 01:00 | 0 | -50 | 0 | 0 |
| 25.03.2023 01:00 - 02:00 | 0 | -50 | 0 | 0 |
| 25.03.2023 02:00 - 03:00 | 0 | -50 | 0 | 0 |
| 25.03.2023 03:00 - 04:00 | 0 | -50 | 0 | 0 |
| 25.03.2023 04:00 - 05:00 | 0 | -50 | 0 | 0 |
| 25.03.2023 05:00 - 06:00 | 0 | -50 | 0 | 0 |
| 25.03.2023 06:00 - 07:00 | 0 | 0 | 0 | 0 |
| 25.03.2023 07:00 - 08:00 | 0 | 0 | 0 | 0 |
| 25.03.2023 08:00 - 09:00 | 0 | 0 | 0 | 0 |
| 25.03.2023 09:00 - 10:00 | 0 | 0 | 0 | 0 |
| 25.03.2023 10:00 - 11:00 | 0 | 0 | 0 | 0 |
| 25.03.2023 11:00 - 12:00 | 0 | 0 | 0 | 0 |
| 25.03.2023 12:00 - 13:00 | 0 | 0 | 0 | 0 |
| 25.03.2023 13:00 - 14:00 | 0 | 0 | 0 | 0 |
| 25.03.2023 14:00 - 15:00 | 0 | 0 | 0 | 0 |
| 25.03.2023 15:00 - 16:00 | 0 | 0 | 0 | 0 |
| 25.03.2023 16:00 - 17:00 | 0 | 0 | 0 | 0 |
| 25.03.2023 17:00 - 18:00 | 0 | 0 | 0 | 0 |
| 25.03.2023 18:00 - 19:00 | 0 | 0 | 0 | 0 |
| 25.03.2023 19:00 - 20:00 | 0 | 0 | 0 | 0 |
| 25.03.2023 20:00 - 21:00 | 0 | 0 | 0 | 0 |
| 25.03.2023 21:00 - 22:00 | 0 | 0 | 0 | 0 |
| 25.03.2023 22:00 - 23:00 | 0 | 0 | 0 | 0 |
| 25.03.2023 23:00 - 24:00 | 0 | 0 | 0 | 0 |
| 26.03.2023 00:00 - 01:00 | 0 | -60 | 0 | 0 |
| 26.03.2023 01:00 - 03:00 | 0 | -60 | 0 | 0 |
| 26.03.2023 03:00 - 04:00 | 0 | -60 | 0 | 0 |
| 26.03.2023 04:00 - 05:00 | 0 | -60 | 0 | 0 |
| 26.03.2023 05:00 - 06:00 | 0 | -60 | 0 | 0 |
| 26.03.2023 06:00 - 07:00 | 0 | 0 | 0 | 0 |
| 26.03.2023 07:00 - 08:00 | 0 | 0 | 0 | 0 |
| 26.03.2023 08:00 - 09:00 | 0 | 0 | 0 | 0 |
| 26.03.2023 09:00 - 10:00 | 0 | 0 | 0 | 0 |
| 26.03.2023 10:00 - 11:00 | 0 | 0 | 0 | 0 |
| 26.03.2023 11:00 - 12:00 | 0 | 0 | 0 | 0 |
| 26.03.2023 12:00 - 13:00 | 0 | 0 | 0 | 0 |
| 26.03.2023 13:00 - 14:00 | 0 | 0 | 0 | 0 |
| 26.03.2023 14:00 - 15:00 | 0 | 0 | 0 | 0 |
| 26.03.2023 15:00 - 16:00 | 0 | 0 | 0 | 0 |
| 26.03.2023 16:00 - 17:00 | 0 | 0 | 0 | 0 |
| 26.03.2023 17:00 - 18:00 | 0 | 0 | 0 | 0 |
| 26.03.2023 18:00 - 19:00 | 0 | 0 | 0 | 0 |
| 26.03.2023 19:00 - 20:00 | 0 | 0 | 0 | 0 |
| 26.03.2023 20:00 - 21:00 | 0 | 0 | 0 | 0 |
| 26.03.2023 21:00 - 22:00 | 0 | 0 | 0 | 0 |
| 26.03.2023 22:00 - 23:00 | 0 | 0 | 0 | 0 |
| 26.03.2023 23:00 - 24:00 | 0 | 0 | 0 | 0 |
| 27.03.2023 00:00 - 01:00 | 0 | 0 | 0 | 0 |
| 27.03.2023 01:00 - 02:00 | 0 | 0 | 0 | 0 |
| 27.03.2023 02:00 - 03:00 | 0 | 0 | 0 | 0 |
| 27.03.2023 03:00 - 04:00 | 0 | 0 | 0 | 0 |
| 27.03.2023 04:00 - 05:00 | 0 | 0 | 0 | 0 |
| 27.03.2023 05:00 - 06:00 | 0 | 0 | 0 | 0 |
| 27.03.2023 06:00 - 07:00 | 0 | 0 | 0 | 0 |
| 27.03.2023 07:00 - 08:00 | 0 | 0 | 0 | 0 |
| 27.03.2023 08:00 - 09:00 | 0 | 0 | 0 | 0 |
| 27.03.2023 09:00 - 10:00 | 0 | 0 | 0 | 0 |
| 27.03.2023 10:00 - 11:00 | 0 | 0 | 0 | 0 |
| 27.03.2023 11:00 - 12:00 | 0 | 0 | 0 | 0 |
| 27.03.2023 12:00 - 13:00 | 0 | 0 | 0 | 0 |
| 27.03.2023 13:00 - 14:00 | 0 | 0 | 0 | 0 |
| 27.03.2023 14:00 - 15:00 | 0 | 0 | 0 | 0 |
| 27.03.2023 15:00 - 16:00 | 0 | 0 | 0 | 0 |
| 27.03.2023 16:00 - 17:00 | 0 | 0 | 0 | 0 |
| 27.03.2023 17:00 - 18:00 | 0 | 0 | 0 | 0 |
| 27.03.2023 18:00 - 19:00 | 0 | 0 | 0 | 0 |
| 27.03.2023 19:00 - 20:00 | 0 | 0 | 0 | 0 |
| 27.03.2023 20:00 - 21:00 | 0 | 0 | 0 | 0 |
| 27.03.2023 21:00 - 22:00 | 0 | 0 | 0 | 0 |
| 27.03.2023 22:00 - 23:00 | 0 | 0 | 0 | 0 |
| 27.03.2023 23:00 - 24:00 | 0 | 0 | 0 | 0 |
| 28.03.2023 00:00 - 01:00 | 0 | 0 | 0 | 0 |
| 28.03.2023 01:00 - 02:00 | 0 | -30 | 0 | 0 |
| 28.03.2023 02:00 - 03:00 | 0 | -30 | 0 | 0 |
| 28.03.2023 03:00 - 04:00 | 0 | -30 | 0 | 0 |
| 28.03.2023 04:00 - 05:00 | 0 | -30 | 0 | 0 |
| 28.03.2023 05:00 - 06:00 | 0 | -30 | 0 | 0 |
| 28.03.2023 06:00 - 07:00 | 0 | 0 | 0 | 0 |
| 28.03.2023 07:00 - 08:00 | 0 | 0 | 0 | 0 |
| 28.03.2023 08:00 - 09:00 | 0 | 0 | 0 | 0 |
| 28.03.2023 09:00 - 10:00 | 0 | 0 | 0 | 0 |
| 28.03.2023 10:00 - 11:00 | 0 | 0 | 0 | 0 |
| 28.03.2023 11:00 - 12:00 | 0 | 0 | 0 | 0 |
| 28.03.2023 12:00 - 13:00 | 0 | 0 | 0 | 0 |
| 28.03.2023 13:00 - 14:00 | 0 | 0 | 0 | 0 |
| 28.03.2023 14:00 - 15:00 | 0 | 0 | 0 | 0 |
| 28.03.2023 15:00 - 16:00 | 0 | 0 | 0 | 0 |
| 28.03.2023 16:00 - 17:00 | 0 | 0 | 0 | 0 |
| 28.03.2023 17:00 - 18:00 | 0 | 0 | 0 | 0 |
| 28.03.2023 18:00 - 19:00 | 0 | 0 | 0 | 0 |
| 28.03.2023 19:00 - 20:00 | 0 | 0 | 0 | 0 |
| 28.03.2023 20:00 - 21:00 | 0 | -60 | 0 | 0 |
| 28.03.2023 21:00 - 22:00 | 0 | -60 | 0 | 0 |
| 28.03.2023 22:00 - 23:00 | 0 | -160 | 0 | 0 |
| 28.03.2023 23:00 - 24:00 | 0 | -240 | 0 | 0 |
| 29.03.2023 00:00 - 01:00 | 0 | -240 | 0 | 0 |
| 29.03.2023 01:00 - 02:00 | 0 | -240 | 0 | 0 |
| 29.03.2023 02:00 - 03:00 | 0 | -240 | 0 | 0 |
| 29.03.2023 03:00 - 04:00 | 0 | -240 | 0 | 0 |
| 29.03.2023 04:00 - 05:00 | 0 | -240 | 0 | 0 |
| 29.03.2023 05:00 - 06:00 | 0 | -240 | 0 | 0 |
| 29.03.2023 06:00 - 07:00 | 0 | 0 | 0 | 0 |
| 29.03.2023 07:00 - 08:00 | 0 | 0 | 0 | 0 |
| 29.03.2023 08:00 - 09:00 | 0 | 0 | 0 | 0 |
| 29.03.2023 09:00 - 10:00 | 0 | 0 | 0 | 0 |
| 29.03.2023 10:00 - 11:00 | 0 | 0 | 0 | 0 |
| 29.03.2023 11:00 - 12:00 | 0 | 0 | 0 | 0 |
| 29.03.2023 12:00 - 13:00 | 0 | 0 | 0 | 0 |
| 29.03.2023 13:00 - 14:00 | 0 | 0 | 0 | 0 |
| 29.03.2023 14:00 - 15:00 | 0 | 0 | 0 | 0 |
| 29.03.2023 15:00 - 16:00 | 0 | 0 | 0 | 0 |
| 29.03.2023 16:00 - 17:00 | 0 | 0 | 0 | 0 |
| 29.03.2023 17:00 - 18:00 | 0 | 0 | 0 | 0 |
| 29.03.2023 18:00 - 19:00 | 0 | 0 | 0 | 0 |
| 29.03.2023 19:00 - 20:00 | 0 | 0 | 0 | 0 |
| 29.03.2023 20:00 - 21:00 | 0 | 0 | 0 | 0 |
| 29.03.2023 21:00 - 22:00 | 0 | 0 | 0 | 0 |
| 29.03.2023 22:00 - 23:00 | 0 | 0 | 0 | 0 |
| 29.03.2023 23:00 - 24:00 | 0 | 0 | 0 | 0 |
| 30.03.2023 00:00 - 01:00 | 0 | 0 | 0 | 0 |
| 30.03.2023 01:00 - 02:00 | 0 | 0 | 0 | 0 |
| 30.03.2023 02:00 - 03:00 | 0 | 0 | 0 | 0 |
| 30.03.2023 03:00 - 04:00 | 0 | 0 | 0 | 0 |
| 30.03.2023 04:00 - 05:00 | 0 | 0 | 0 | 0 |
| 30.03.2023 05:00 - 06:00 | 0 | 0 | 0 | 0 |
| 30.03.2023 06:00 - 07:00 | 0 | 0 | 0 | 0 |
| 30.03.2023 07:00 - 08:00 | 0 | 0 | 0 | 0 |
| 30.03.2023 08:00 - 09:00 | 0 | 0 | 0 | 0 |
| 30.03.2023 09:00 - 10:00 | 0 | 0 | 0 | 0 |
| 30.03.2023 10:00 - 11:00 | 0 | 0 | 0 | 0 |
| 30.03.2023 11:00 - 12:00 | 0 | 0 | 0 | 0 |
| 30.03.2023 12:00 - 13:00 | 0 | 0 | 0 | 0 |
| 30.03.2023 13:00 - 14:00 | 0 | 0 | 0 | 0 |
| 30.03.2023 14:00 - 15:00 | 0 | 0 | 0 | 0 |
| 30.03.2023 15:00 - 16:00 | 0 | 0 | 0 | 0 |
| 30.03.2023 16:00 - 17:00 | 0 | 0 | 0 | 0 |
| 30.03.2023 17:00 - 18:00 | 0 | 0 | 0 | 0 |
| 30.03.2023 18:00 - 19:00 | 0 | 0 | 0 | 0 |
| 30.03.2023 19:00 - 20:00 | 0 | 0 | 0 | 0 |
| 30.03.2023 20:00 - 21:00 | 0 | 0 | 0 | 0 |
| 30.03.2023 21:00 - 22:00 | 0 | 0 | 0 | 0 |
| 30.03.2023 22:00 - 23:00 | 0 | 0 | 0 | 0 |
| 30.03.2023 23:00 - 24:00 | 0 | 0 | 0 | 0 |
| 31.03.2023 00:00 - 01:00 | 0 | 0 | 0 | 0 |
| 31.03.2023 01:00 - 02:00 | 0 | 0 | 0 | 0 |
| 31.03.2023 02:00 - 03:00 | 0 | 0 | 0 | 0 |
| 31.03.2023 03:00 - 04:00 | 0 | 0 | 0 | 0 |
| 31.03.2023 04:00 - 05:00 | 0 | 0 | 0 | 0 |
| 31.03.2023 05:00 - 06:00 | 0 | 0 | 0 | 0 |
| 31.03.2023 06:00 - 07:00 | 0 | 0 | 0 | 0 |
| 31.03.2023 07:00 - 08:00 | 0 | 0 | 0 | 0 |
| 31.03.2023 08:00 - 09:00 | 0 | 0 | 0 | 0 |
| 31.03.2023 09:00 - 10:00 | 0 | 0 | 0 | 0 |
| 31.03.2023 10:00 - 11:00 | 0 | 0 | 0 | 0 |
| 31.03.2023 11:00 - 12:00 | 0 | 0 | 0 | 0 |
| 31.03.2023 12:00 - 13:00 | 0 | 0 | 0 | 0 |
| 31.03.2023 13:00 - 14:00 | 0 | 0 | 0 | 0 |
| 31.03.2023 14:00 - 15:00 | 0 | 0 | 0 | 0 |
| 31.03.2023 15:00 - 16:00 | 0 | 0 | 0 | 0 |
| 31.03.2023 16:00 - 17:00 | 0 | 0 | 0 | 0 |
| 31.03.2023 17:00 - 18:00 | 0 | 0 | 0 | 0 |
| 31.03.2023 18:00 - 19:00 | 0 | 0 | 0 | 0 |
| 31.03.2023 19:00 - 20:00 | 0 | 0 | 0 | 0 |
| 31.03.2023 20:00 - 21:00 | 0 | 0 | 0 | 0 |
| 31.03.2023 21:00 - 22:00 | 0 | 0 | 0 | 0 |
| 31.03.2023 22:00 - 23:00 | 0 | 0 | 0 | 0 |
| 31.03.2023 23:00 - 24:00 | 0 | 0 | 0 | 0 |
| 01.04.2023 00:00 - 01:00 | 0 | 0 | 0 | 0 |
| 01.04.2023 01:00 - 02:00 | 0 | 0 | 0 | 0 |
| 01.04.2023 02:00 - 03:00 | 0 | 0 | 0 | 0 |
| 01.04.2023 03:00 - 04:00 | 0 | 0 | 0 | 0 |
| 01.04.2023 04:00 - 05:00 | 0 | 0 | 0 | 0 |
| 01.04.2023 05:00 - 06:00 | 0 | 0 | 0 | 0 |